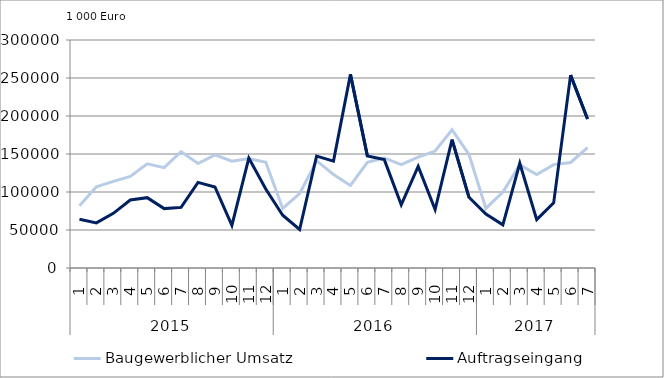
| Category | Baugewerblicher Umsatz | Auftragseingang |
|---|---|---|
| 0 | 81937.361 | 64244.383 |
| 1 | 106908.454 | 59377.677 |
| 2 | 113904.285 | 71953.971 |
| 3 | 120612.446 | 89496.024 |
| 4 | 137142.75 | 92563.213 |
| 5 | 132019.811 | 78131.737 |
| 6 | 153125.961 | 79765.729 |
| 7 | 137370.133 | 112637.987 |
| 8 | 148792.629 | 106572.56 |
| 9 | 140483.911 | 56073.767 |
| 10 | 144146.162 | 144643.688 |
| 11 | 139085.889 | 103931.175 |
| 12 | 78291.738 | 69470.357 |
| 13 | 97863.379 | 50640.033 |
| 14 | 141176.119 | 147206.65 |
| 15 | 123121.297 | 140579.009 |
| 16 | 108561.124 | 254739.334 |
| 17 | 139030.209 | 147481.644 |
| 18 | 144784.416 | 142609.658 |
| 19 | 135870.195 | 83192.156 |
| 20 | 145961.738 | 133594.351 |
| 21 | 153886.826 | 76793.838 |
| 22 | 181740.037 | 168867.568 |
| 23 | 149348.138 | 93011.853 |
| 24 | 78446.78 | 70908.903 |
| 25 | 99841.908 | 56868.408 |
| 26 | 135679.867 | 137790.423 |
| 27 | 123004.403 | 63637.761 |
| 28 | 136010.071 | 85644.63 |
| 29 | 138859.308 | 253791.552 |
| 30 | 158353.879 | 196034.198 |